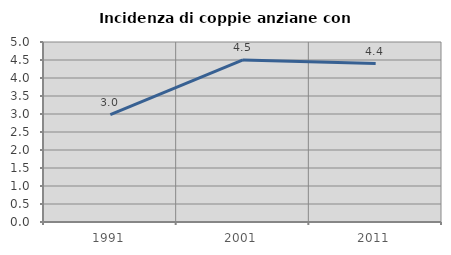
| Category | Incidenza di coppie anziane con figli |
|---|---|
| 1991.0 | 2.985 |
| 2001.0 | 4.501 |
| 2011.0 | 4.402 |